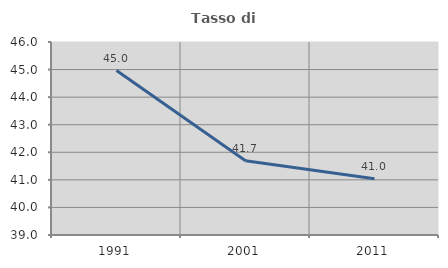
| Category | Tasso di occupazione   |
|---|---|
| 1991.0 | 44.965 |
| 2001.0 | 41.697 |
| 2011.0 | 41.039 |